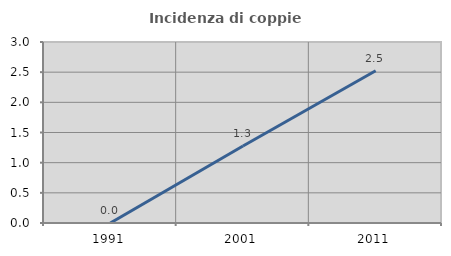
| Category | Incidenza di coppie miste |
|---|---|
| 1991.0 | 0 |
| 2001.0 | 1.277 |
| 2011.0 | 2.524 |